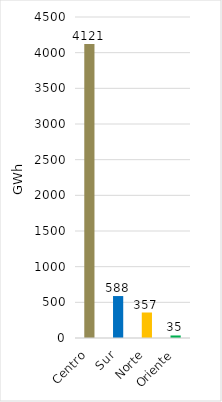
| Category | Series 0 |
|---|---|
| Centro | 4121.002 |
| Sur | 588.066 |
| Norte | 357.416 |
| Oriente | 35.386 |